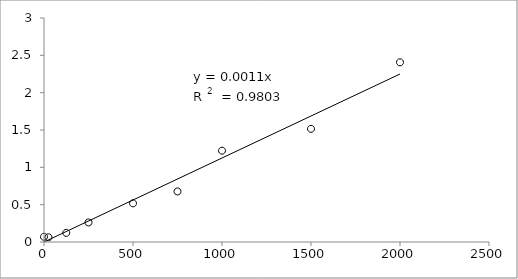
| Category | Series 0 |
|---|---|
| 2000.0 | 2.406 |
| 1500.0 | 1.515 |
| 1000.0 | 1.223 |
| 750.0 | 0.677 |
| 500.0 | 0.518 |
| 250.0 | 0.262 |
| 125.0 | 0.122 |
| 25.0 | 0.064 |
| 0.0 | 0.07 |